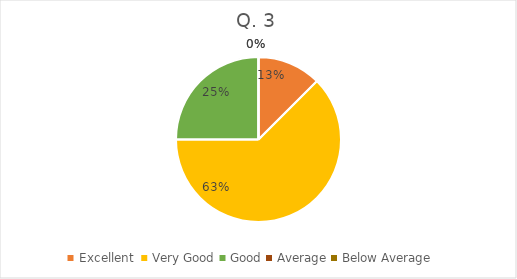
| Category | Series 0 |
|---|---|
| Excellent  | 2 |
| Very Good | 10 |
| Good | 4 |
| Average | 0 |
| Below Average | 0 |